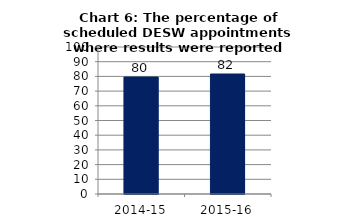
| Category | Chart 6: The percentage of scheduled DRSSW appointments whose results were reported |
|---|---|
| 2014-15 | 79.54 |
| 2015-16 | 81.628 |